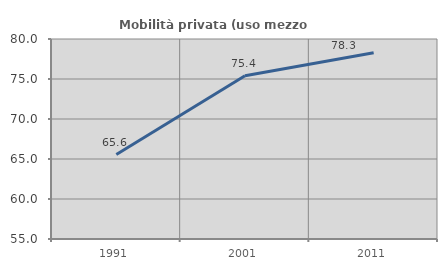
| Category | Mobilità privata (uso mezzo privato) |
|---|---|
| 1991.0 | 65.551 |
| 2001.0 | 75.399 |
| 2011.0 | 78.272 |